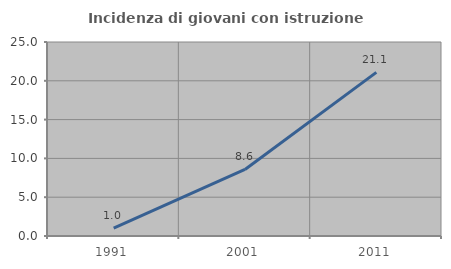
| Category | Incidenza di giovani con istruzione universitaria |
|---|---|
| 1991.0 | 1.026 |
| 2001.0 | 8.571 |
| 2011.0 | 21.084 |